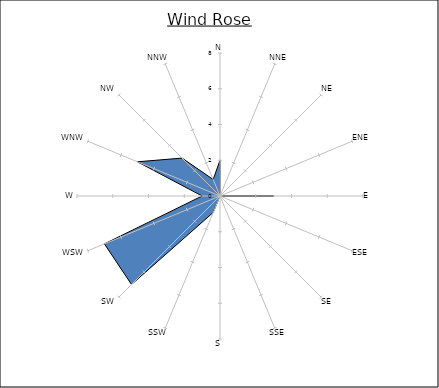
| Category | Series 0 |
|---|---|
| N | 2 |
| NNE | 0 |
| NE | 0 |
| ENE | 0 |
| E | 3 |
| ESE | 0 |
| SE | 1 |
| SSE | 0 |
| S | 0 |
| SSW | 1 |
| SW | 7 |
| WSW | 7 |
| W | 1 |
| WNW | 5 |
| NW | 3 |
| NNW | 1 |